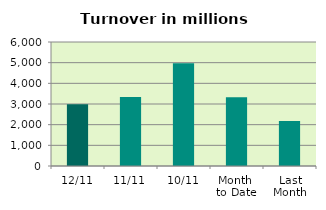
| Category | Series 0 |
|---|---|
| 12/11 | 2984.728 |
| 11/11 | 3337.527 |
| 10/11 | 4967.52 |
| Month 
to Date | 3326.214 |
| Last
Month | 2179.795 |